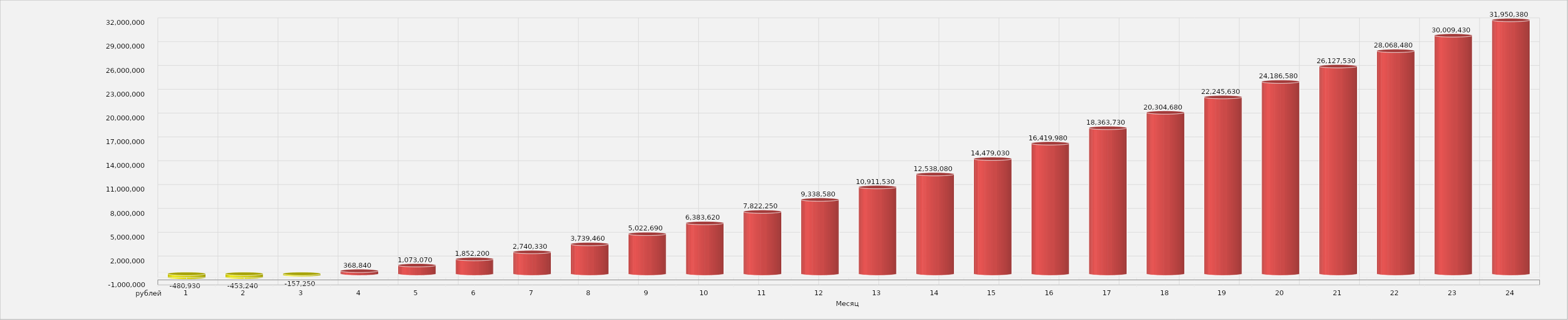
| Category | 1 2 3 4 5 6 7 8 9 10 11 12 13 14 15 16 17 18 19 20 21 22 23 24 |
|---|---|
| 0 | -480930 |
| 1 | -453240 |
| 2 | -157250 |
| 3 | 368840 |
| 4 | 1073070 |
| 5 | 1852200 |
| 6 | 2740330 |
| 7 | 3739460 |
| 8 | 5022690 |
| 9 | 6383620 |
| 10 | 7822250 |
| 11 | 9338580 |
| 12 | 10911530 |
| 13 | 12538080 |
| 14 | 14479030 |
| 15 | 16419980 |
| 16 | 18363730 |
| 17 | 20304680 |
| 18 | 22245630 |
| 19 | 24186580 |
| 20 | 26127530 |
| 21 | 28068480 |
| 22 | 30009430 |
| 23 | 31950380 |